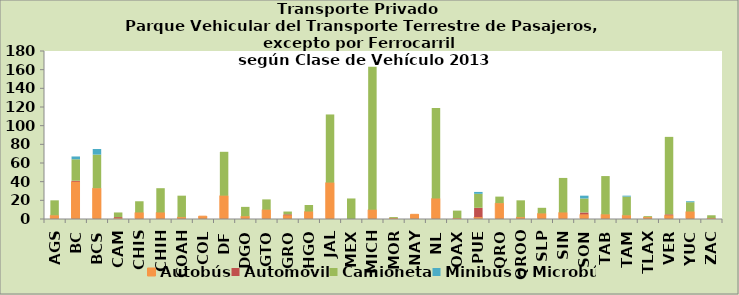
| Category | Autobús | Automóvil | Camioneta | Minibús o Microbús |
|---|---|---|---|---|
| AGS | 4 | 0 | 16 | 0 |
| BC | 40 | 1 | 23 | 3 |
| BCS | 33 | 0 | 36 | 6 |
| CAM | 1 | 1 | 5 | 0 |
| CHIS | 7 | 0 | 12 | 0 |
| CHIH | 7 | 0 | 26 | 0 |
| COAH | 2 | 0 | 23 | 0 |
| COL | 3 | 0 | 0 | 0 |
| DF | 25 | 0 | 47 | 0 |
| DGO | 3 | 0 | 10 | 0 |
| GTO | 10 | 0 | 11 | 0 |
| GRO | 4 | 1 | 3 | 0 |
| HGO | 8 | 0 | 7 | 0 |
| JAL | 39 | 0 | 73 | 0 |
| MEX | 0 | 0 | 22 | 0 |
| MICH | 10 | 0 | 153 | 0 |
| MOR | 1 | 0 | 1 | 0 |
| NAY | 5 | 0 | 0 | 0 |
| NL | 22 | 0 | 97 | 0 |
| OAX | 1 | 0 | 8 | 0 |
| PUE | 2 | 10 | 15 | 2 |
| QRO | 17 | 0 | 7 | 0 |
| QROO | 2 | 0 | 18 | 0 |
| SLP | 6 | 0 | 6 | 0 |
| SIN | 7 | 0 | 37 | 0 |
| SON | 5 | 2 | 15 | 3 |
| TAB | 5 | 0 | 41 | 0 |
| TAM | 4 | 0 | 20 | 1 |
| TLAX | 2 | 0 | 1 | 0 |
| VER | 4 | 1 | 83 | 0 |
| YUC | 8 | 0 | 10 | 1 |
| ZAC | 1 | 0 | 3 | 0 |